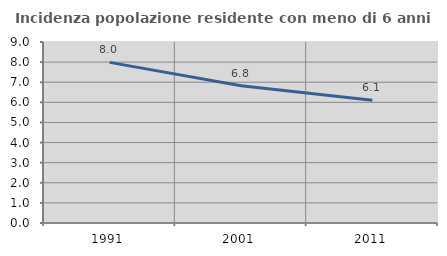
| Category | Incidenza popolazione residente con meno di 6 anni |
|---|---|
| 1991.0 | 7.988 |
| 2001.0 | 6.825 |
| 2011.0 | 6.102 |